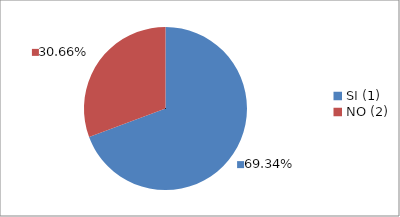
| Category | Series 0 |
|---|---|
| SI (1) | 0.693 |
| NO (2) | 0.307 |